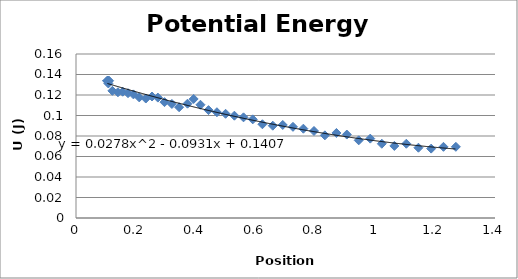
| Category | Potential Energy (J) |
|---|---|
| 0.106066 | 0.133 |
| 0.110508 | 0.134 |
| 0.108009 | 0.134 |
| 0.105788 | 0.134 |
| 0.106066 | 0.134 |
| 0.10551 | 0.134 |
| 0.105233 | 0.134 |
| 0.10551 | 0.134 |
| 0.104955 | 0.134 |
| 0.108009 | 0.131 |
| 0.121614 | 0.124 |
| 0.140218 | 0.123 |
| 0.156044 | 0.123 |
| 0.173814 | 0.122 |
| 0.191862 | 0.121 |
| 0.211298 | 0.118 |
| 0.233233 | 0.117 |
| 0.254057 | 0.119 |
| 0.273494 | 0.117 |
| 0.295706 | 0.113 |
| 0.320418 | 0.111 |
| 0.344574 | 0.108 |
| 0.372618 | 0.112 |
| 0.393164 | 0.116 |
| 0.415932 | 0.11 |
| 0.442865 | 0.105 |
| 0.470909 | 0.103 |
| 0.499785 | 0.102 |
| 0.529217 | 0.1 |
| 0.559759 | 0.098 |
| 0.59058 | 0.096 |
| 0.622788 | 0.091 |
| 0.657495 | 0.09 |
| 0.690814 | 0.091 |
| 0.724966 | 0.089 |
| 0.759674 | 0.087 |
| 0.795214 | 0.085 |
| 0.831587 | 0.081 |
| 0.870182 | 0.083 |
| 0.904889 | 0.081 |
| 0.944594 | 0.076 |
| 0.983189 | 0.077 |
| 1.02178 | 0.072 |
| 1.06371 | 0.07 |
| 1.10369 | 0.072 |
| 1.14423 | 0.069 |
| 1.18671 | 0.068 |
| 1.22781 | 0.069 |
| 1.26918 | 0.069 |